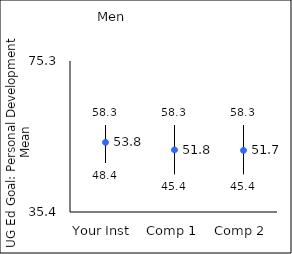
| Category | 25th percentile | 75th percentile | Mean |
|---|---|---|---|
| Your Inst | 48.4 | 58.3 | 53.8 |
| Comp 1 | 45.4 | 58.3 | 51.81 |
| Comp 2 | 45.4 | 58.3 | 51.68 |